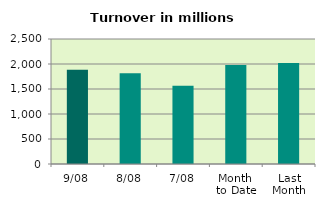
| Category | Series 0 |
|---|---|
| 9/08 | 1885.562 |
| 8/08 | 1817.357 |
| 7/08 | 1566.964 |
| Month 
to Date | 1978.285 |
| Last
Month | 2019.592 |